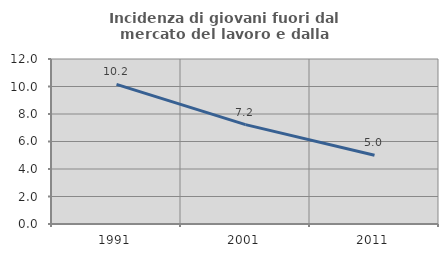
| Category | Incidenza di giovani fuori dal mercato del lavoro e dalla formazione  |
|---|---|
| 1991.0 | 10.152 |
| 2001.0 | 7.229 |
| 2011.0 | 5 |